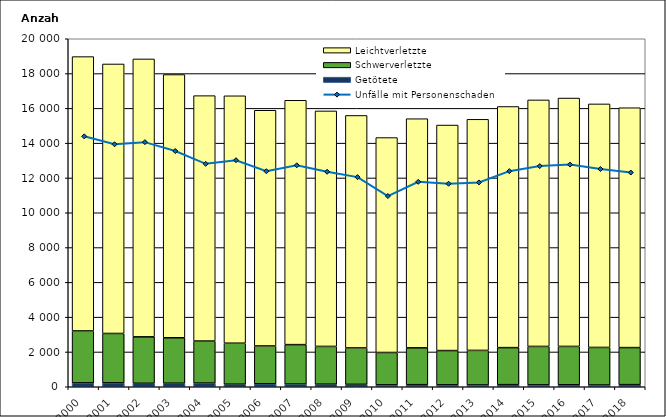
| Category | Getötete | Schwerverletzte | Leichtverletzte |
|---|---|---|---|
| 2000.0 | 223 | 2985 | 15767 |
| 2001.0 | 226 | 2837 | 15488 |
| 2002.0 | 199 | 2670 | 15971 |
| 2003.0 | 204 | 2611 | 15128 |
| 2004.0 | 212 | 2415 | 14104 |
| 2005.0 | 148 | 2355 | 14219 |
| 2006.0 | 172 | 2173 | 13546 |
| 2007.0 | 156 | 2265 | 14043 |
| 2008.0 | 149 | 2169 | 13535 |
| 2009.0 | 140 | 2092 | 13360 |
| 2010.0 | 108 | 1862 | 12352 |
| 2011.0 | 120 | 2116 | 13169 |
| 2012.0 | 110 | 1970 | 12961 |
| 2013.0 | 103 | 1987 | 13280 |
| 2014.0 | 121 | 2128 | 13858 |
| 2015.0 | 107 | 2211 | 14167 |
| 2016.0 | 114 | 2205 | 14274 |
| 2017.0 | 100 | 2160 | 13995 |
| 2018.0 | 122 | 2129 | 13785 |